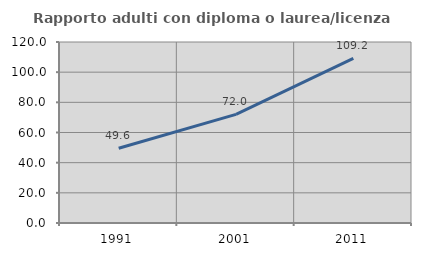
| Category | Rapporto adulti con diploma o laurea/licenza media  |
|---|---|
| 1991.0 | 49.592 |
| 2001.0 | 71.995 |
| 2011.0 | 109.194 |